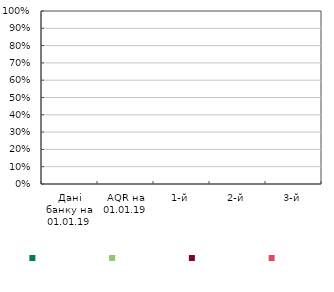
| Category | Series 0 | Series 1 | Series 2 | Series 3 |
|---|---|---|---|---|
| Дані банку на 01.01.19 | 0 | 0 | 0 | 0 |
| AQR на 01.01.19 | 0 | 0 | 0 | 0 |
| 1-й | 0 | 0 | 0 | 0 |
| 2-й | 0 | 0 | 0 | 0 |
| 3-й | 0 | 0 | 0 | 0 |